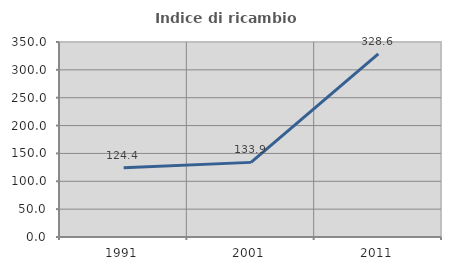
| Category | Indice di ricambio occupazionale  |
|---|---|
| 1991.0 | 124.39 |
| 2001.0 | 133.941 |
| 2011.0 | 328.618 |